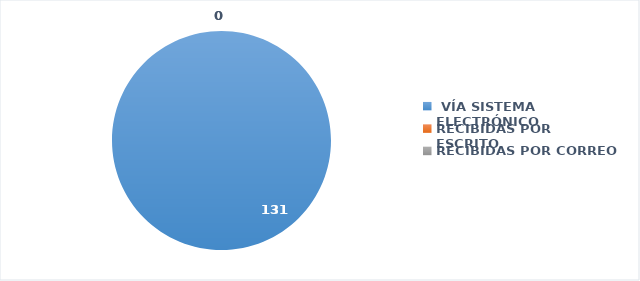
| Category | SOLICITUDES RECIBIDAS |
|---|---|
|  VÍA SISTEMA ELECTRÓNICO | 131 |
| RECIBIDAS POR ESCRITO | 0 |
| RECIBIDAS POR CORREO | 0 |